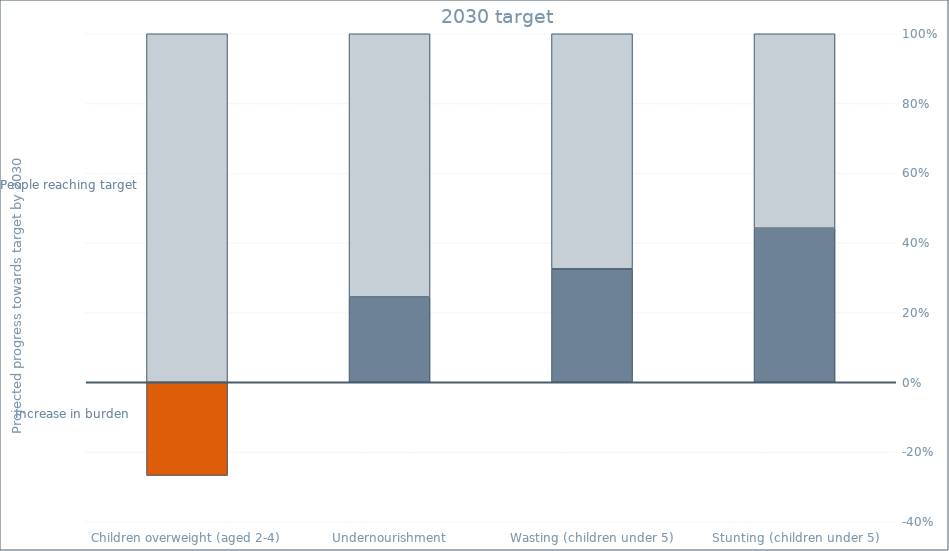
| Category | People reaching target | Increase in burden |
|---|---|---|
| Children overweight (aged 2-4) | -0.267 | 1 |
| Undernourishment | 0.245 | 0.755 |
| Wasting (children under 5) | 0.325 | 0.675 |
| Stunting (children under 5) | 0.442 | 0.558 |